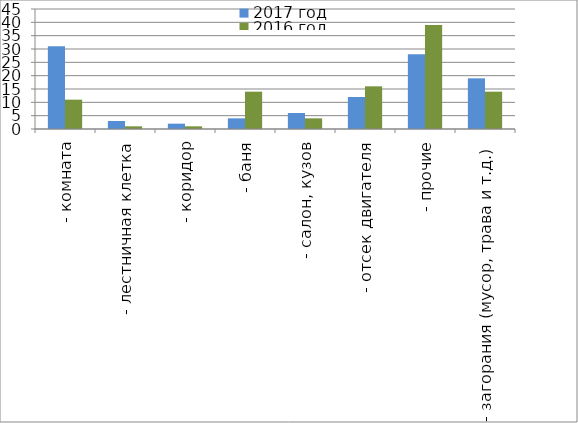
| Category | 2017 год | 2016 год |
|---|---|---|
|  - комната | 31 | 11 |
|  - лестничная клетка | 3 | 1 |
|  - коридор | 2 | 1 |
|  - баня | 4 | 14 |
|  - салон, кузов | 6 | 4 |
|  - отсек двигателя | 12 | 16 |
| - прочие | 28 | 39 |
| - загорания (мусор, трава и т.д.)  | 19 | 14 |